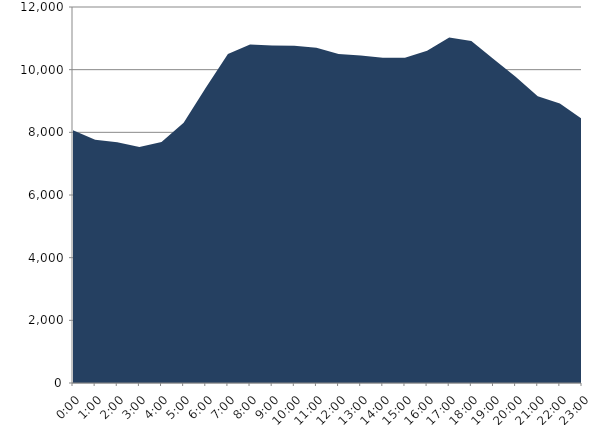
| Category | Series 0 | Series 1 |
|---|---|---|
| 2019-01-16 |  | 8063.03 |
| 2019-01-16 01:00:00 |  | 7762.9 |
| 2019-01-16 02:00:00 |  | 7680.69 |
| 2019-01-16 03:00:00 |  | 7528.05 |
| 2019-01-16 04:00:00 |  | 7693.83 |
| 2019-01-16 05:00:00 |  | 8301.97 |
| 2019-01-16 06:00:00 |  | 9420.24 |
| 2019-01-16 07:00:00 |  | 10498 |
| 2019-01-16 08:00:00 |  | 10802.05 |
| 2019-01-16 09:00:00 |  | 10775.14 |
| 2019-01-16 10:00:00 |  | 10766.99 |
| 2019-01-16 11:00:00 |  | 10697.59 |
| 2019-01-16 12:00:00 |  | 10499.62 |
| 2019-01-16 13:00:00 |  | 10453.55 |
| 2019-01-16 14:00:00 |  | 10378.27 |
| 2019-01-16 15:00:00 |  | 10381.07 |
| 2019-01-16 16:00:00 |  | 10603.32 |
| 2019-01-16 17:00:00 |  | 11026.93 |
| 2019-01-16 18:00:00 |  | 10915.51 |
| 2019-01-16 19:00:00 |  | 10339.95 |
| 2019-01-16 20:00:00 |  | 9776.28 |
| 2019-01-16 21:00:00 |  | 9153.85 |
| 2019-01-16 22:00:00 |  | 8922.02 |
| 2019-01-16 23:00:00 |  | 8428.56 |